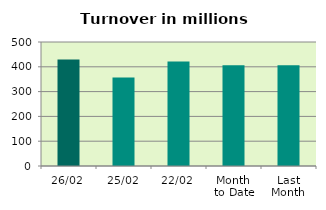
| Category | Series 0 |
|---|---|
| 26/02 | 429.75 |
| 25/02 | 356.806 |
| 22/02 | 421.133 |
| Month 
to Date | 405.868 |
| Last
Month | 406.6 |